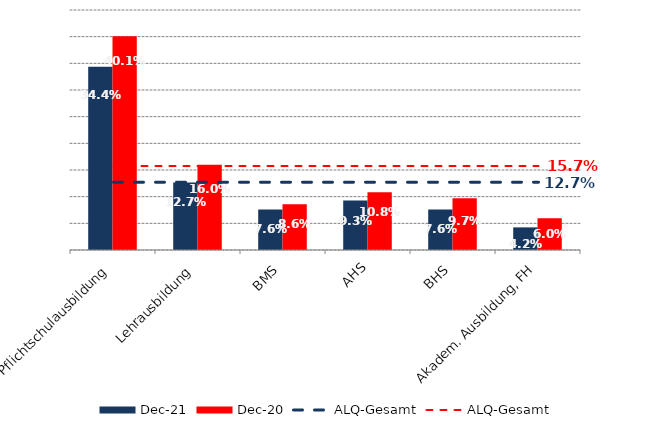
| Category | Dez 21 | Dez 20 |
|---|---|---|
| Pflichtschulausbildung | 0.344 | 0.401 |
| Lehrausbildung | 0.127 | 0.16 |
| BMS | 0.076 | 0.086 |
| AHS | 0.093 | 0.108 |
| BHS | 0.076 | 0.097 |
| Akadem. Ausbildung, FH | 0.042 | 0.06 |